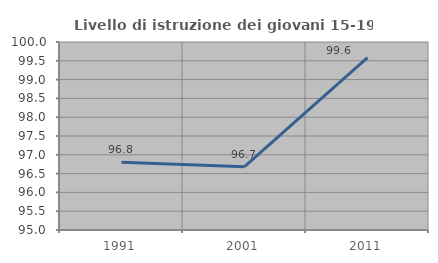
| Category | Livello di istruzione dei giovani 15-19 anni |
|---|---|
| 1991.0 | 96.8 |
| 2001.0 | 96.682 |
| 2011.0 | 99.582 |